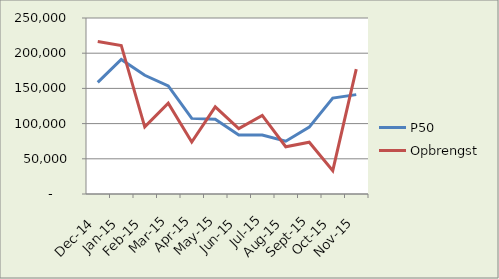
| Category | P50 | Opbrengst |
|---|---|---|
| 2014-12-01 | 158550 | 216500 |
| 2015-01-01 | 191100 | 211000 |
| 2015-02-01 | 168600 | 95350 |
| 2015-03-01 | 153600 | 128950 |
| 2015-04-01 | 107400 | 73800 |
| 2015-05-01 | 106200 | 123700 |
| 2015-06-01 | 83700 | 92850 |
| 2015-07-01 | 83700 | 111700 |
| 2015-08-01 | 75000 | 67100 |
| 2015-09-01 | 94950 | 73500 |
| 2015-10-01 | 136200 | 33200 |
| 2015-11-01 | 141150 | 177300 |